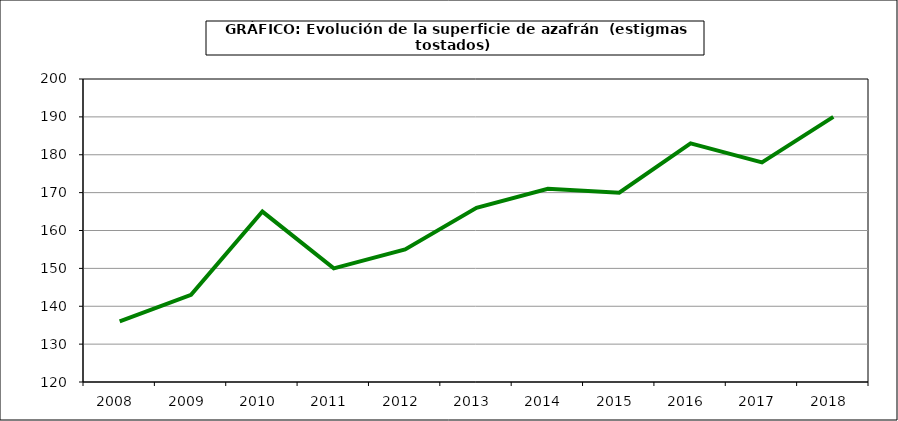
| Category | Superficie |
|---|---|
| 2008.0 | 136 |
| 2009.0 | 143 |
| 2010.0 | 165 |
| 2011.0 | 150 |
| 2012.0 | 155 |
| 2013.0 | 166 |
| 2014.0 | 171 |
| 2015.0 | 170 |
| 2016.0 | 183 |
| 2017.0 | 178 |
| 2018.0 | 190 |